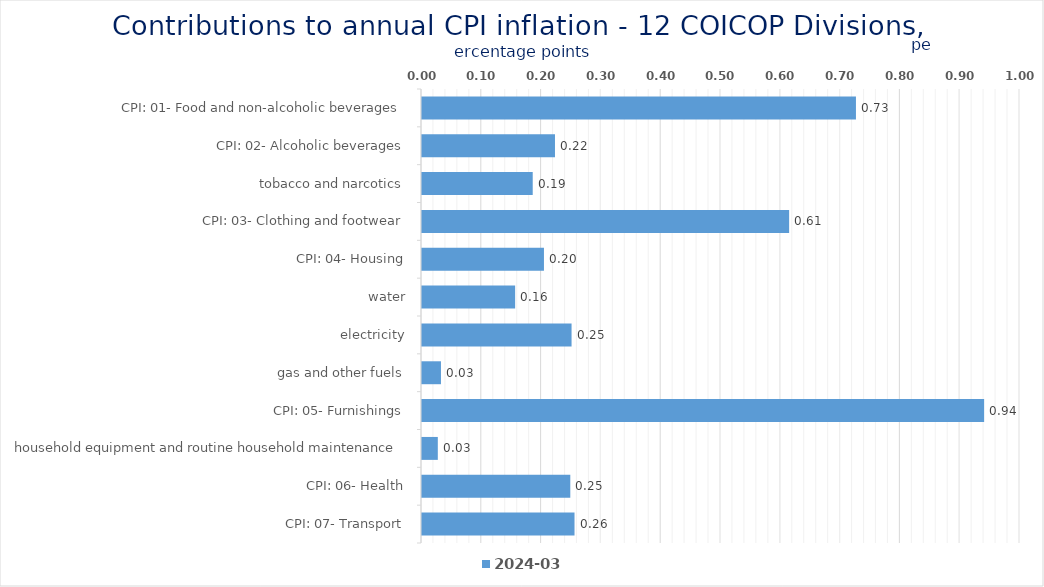
| Category | 2024-03 |
|---|---|
| CPI: 01- Food and non-alcoholic beverages | 0.726 |
| CPI: 02- Alcoholic beverages, tobacco and narcotics | 0.222 |
| CPI: 03- Clothing and footwear | 0.185 |
| CPI: 04- Housing, water, electricity, gas and other fuels | 0.614 |
| CPI: 05- Furnishings, household equipment and routine household maintenance | 0.204 |
| CPI: 06- Health | 0.156 |
| CPI: 07- Transport | 0.25 |
| CPI: 08- Communication | 0.032 |
| CPI: 09- Recreation and culture | 0.94 |
| CPI: 10- Education | 0.026 |
| CPI: 11- Restaurants and hotels | 0.248 |
| CPI: 12- Miscellaneous goods and services | 0.255 |